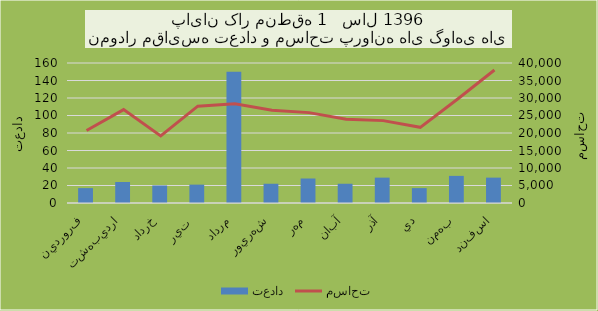
| Category | تعداد |
|---|---|
| فروردين | 17 |
| ارديبهشت | 24 |
| خرداد | 20 |
| تير  | 21 |
| مرداد | 150 |
| شهريور | 22 |
| مهر | 28 |
| آبان | 22 |
| آذر | 29 |
| دي | 17 |
| بهمن | 31 |
| اسفند | 29 |